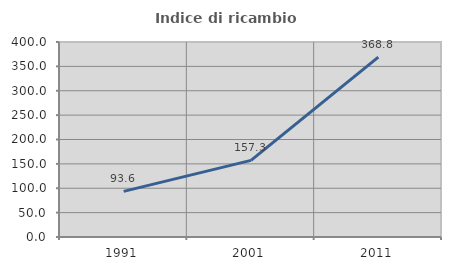
| Category | Indice di ricambio occupazionale  |
|---|---|
| 1991.0 | 93.607 |
| 2001.0 | 157.258 |
| 2011.0 | 368.834 |